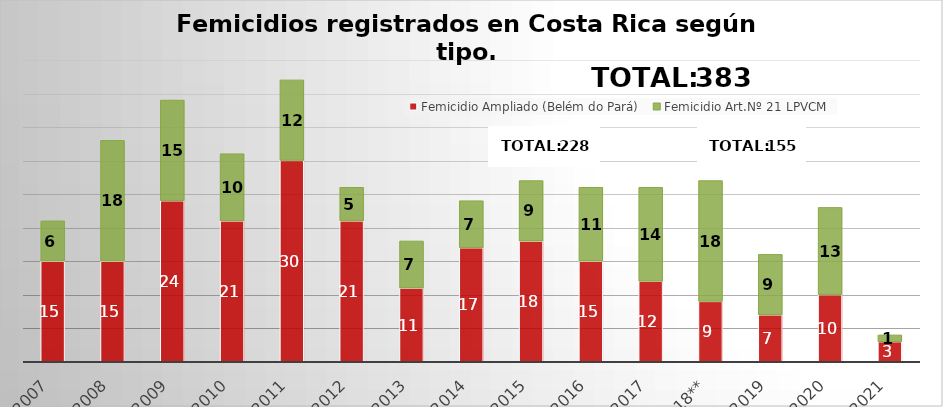
| Category | Femicidio Ampliado (Belém do Pará) | Femicidio Art.Nº 21 LPVCM |
|---|---|---|
| 2007 | 15 | 6 |
| 2008 | 15 | 18 |
| 2009 | 24 | 15 |
| 2010 | 21 | 10 |
| 2011 | 30 | 12 |
| 2012 | 21 | 5 |
| 2013 | 11 | 7 |
| 2014 | 17 | 7 |
| 2015 | 18 | 9 |
| 2016 | 15 | 11 |
| 2017 | 12 | 14 |
| 2018** | 9 | 18 |
| 2019 | 7 | 9 |
| 2020 | 10 | 13 |
| 2021 | 3 | 1 |